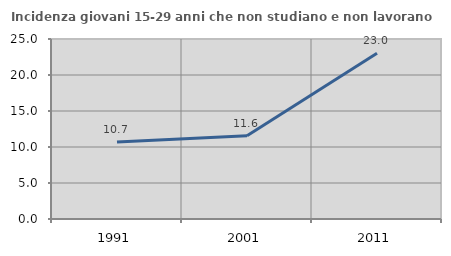
| Category | Incidenza giovani 15-29 anni che non studiano e non lavorano  |
|---|---|
| 1991.0 | 10.685 |
| 2001.0 | 11.57 |
| 2011.0 | 23.009 |